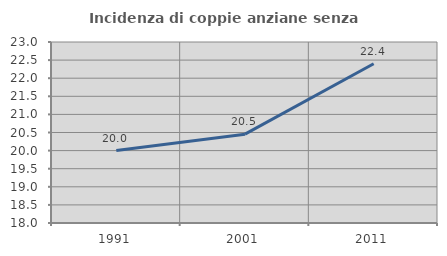
| Category | Incidenza di coppie anziane senza figli  |
|---|---|
| 1991.0 | 20 |
| 2001.0 | 20.455 |
| 2011.0 | 22.4 |